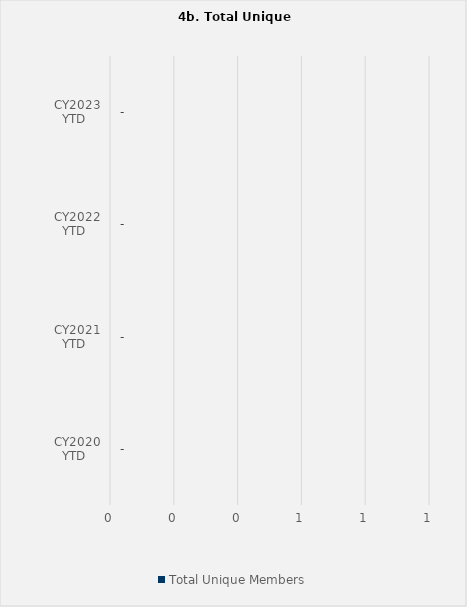
| Category | Total Unique Members |
|---|---|
| CY2020 YTD | 0 |
| CY2021 YTD | 0 |
| CY2022 YTD | 0 |
| CY2023 YTD | 0 |